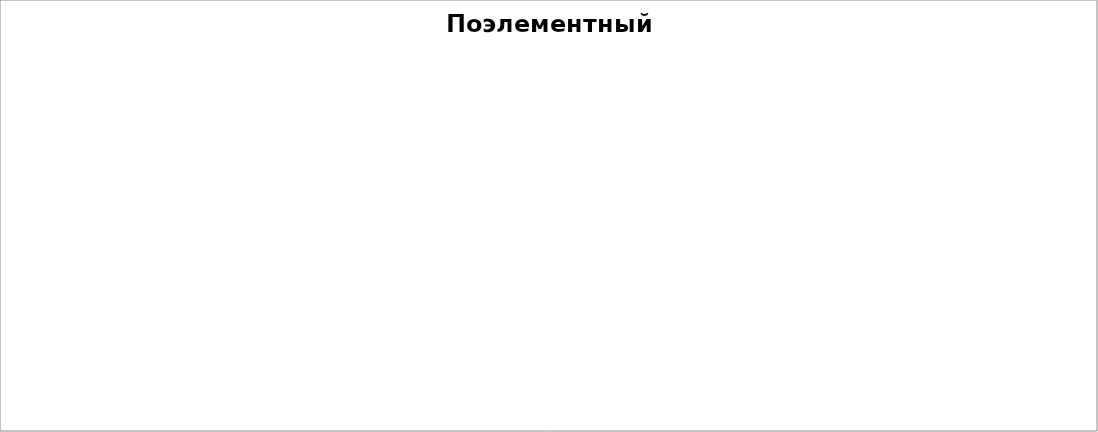
| Category | Series 0 |
|---|---|
| проверяемые безударные гласные в корне слова | 0 |
| непроверяемые гласные и согласные | 0 |
| непроизносимые согласные в корне слова | 0 |
| буквы з и с на конце приставок | 0 |
| чередование гласных в корне слова | 0 |
| буквы е и и в личных окончаниях глаголов | 0 |
| гласные в приставках пре, при | 0 |
| не с разными частями речи | 0 |
| правописание местоимений | 0 |
| н и нн в суффиксах разных частей речи | 0 |
| правописание сложных слов | 0 |
| употребление ъ и ь | 0 |
| знаки препинания при однородных членах предложения | 0 |
| знаки препинания при обращении | 0 |
| знаки препинания при  вводных словах | 0 |
| знаки препинания в СП | 0 |
| знаки препинания при прямой речи, диалоге | 0 |